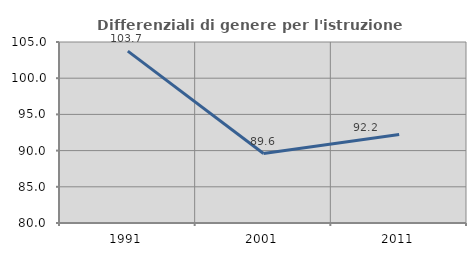
| Category | Differenziali di genere per l'istruzione superiore |
|---|---|
| 1991.0 | 103.733 |
| 2001.0 | 89.597 |
| 2011.0 | 92.222 |